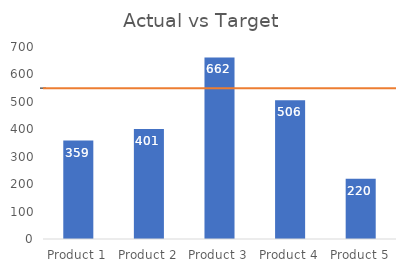
| Category | Actual |
|---|---|
| Product 1 | 359 |
| Product 2 | 401 |
| Product 3 | 662 |
| Product 4 | 506 |
| Product 5 | 220 |